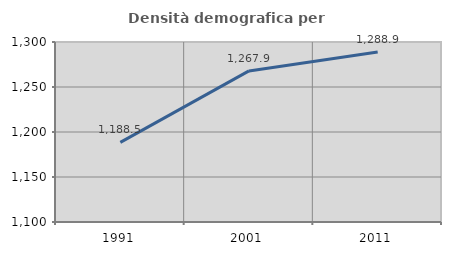
| Category | Densità demografica |
|---|---|
| 1991.0 | 1188.521 |
| 2001.0 | 1267.866 |
| 2011.0 | 1288.909 |